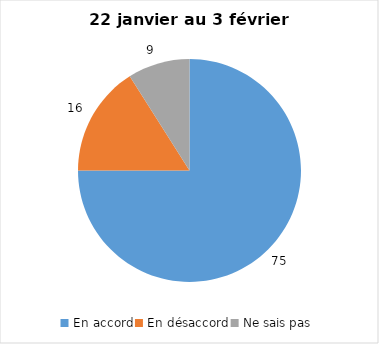
| Category | Series 0 |
|---|---|
| En accord | 75 |
| En désaccord | 16 |
| Ne sais pas | 9 |